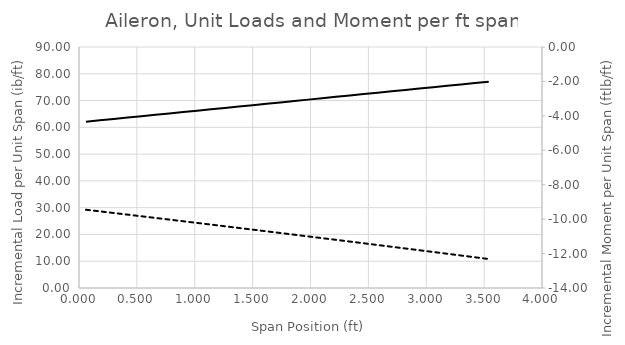
| Category | Series 0 |
|---|---|
| 0.060000000000000005 | 62.101 |
| 0.18000000000000002 | 62.616 |
| 0.30000000000000004 | 63.132 |
| 0.42000000000000004 | 63.647 |
| 0.54 | 64.162 |
| 0.6600000000000001 | 64.678 |
| 0.78 | 65.193 |
| 0.9000000000000001 | 65.708 |
| 1.02 | 66.224 |
| 1.1400000000000001 | 66.739 |
| 1.2600000000000002 | 67.255 |
| 1.3800000000000003 | 67.77 |
| 1.5000000000000004 | 68.285 |
| 1.6200000000000006 | 68.801 |
| 1.7400000000000007 | 69.316 |
| 1.8600000000000008 | 69.831 |
| 1.9800000000000009 | 70.347 |
| 2.100000000000001 | 70.862 |
| 2.220000000000001 | 71.377 |
| 2.340000000000001 | 71.893 |
| 2.4600000000000013 | 72.408 |
| 2.5800000000000014 | 72.924 |
| 2.7000000000000015 | 73.439 |
| 2.8200000000000016 | 73.954 |
| 2.9400000000000017 | 74.47 |
| 3.060000000000002 | 74.985 |
| 3.180000000000002 | 75.5 |
| 3.300000000000002 | 76.016 |
| 3.420000000000002 | 76.531 |
| 3.5400000000000023 | 77.046 |